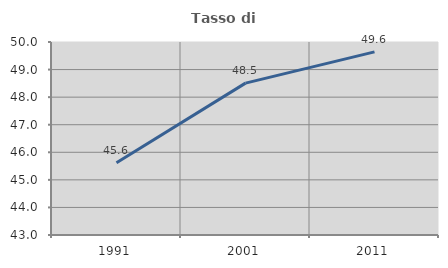
| Category | Tasso di occupazione   |
|---|---|
| 1991.0 | 45.617 |
| 2001.0 | 48.509 |
| 2011.0 | 49.643 |